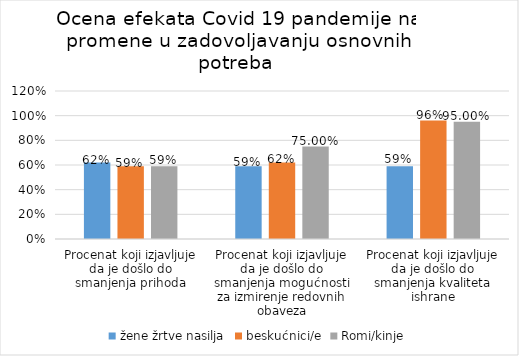
| Category | žene žrtve nasilja | beskućnici/e | Romi/kinje |
|---|---|---|---|
| Procenat koji izjavljuje da je došlo do smanjenja prihoda | 0.62 | 0.59 | 0.59 |
| Procenat koji izjavljuje da je došlo do smanjenja mogućnosti za izmirenje redovnih obaveza | 0.59 | 0.62 | 0.75 |
| Procenat koji izjavljuje da je došlo do smanjenja kvaliteta ishrane | 0.59 | 0.96 | 0.95 |